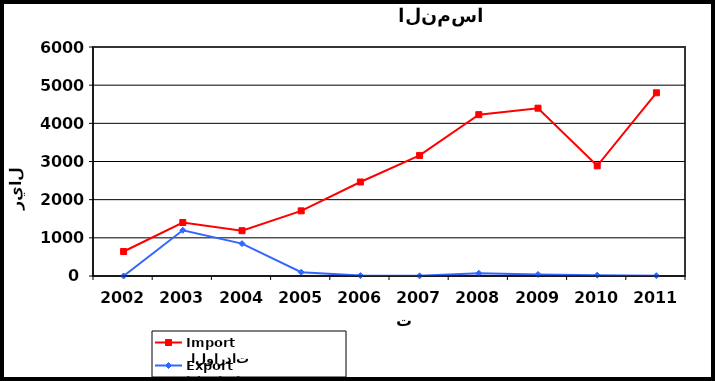
| Category |  الواردات           Import | الصادرات          Export |
|---|---|---|
| 2002.0 | 642 | 1 |
| 2003.0 | 1402 | 1199 |
| 2004.0 | 1187 | 849 |
| 2005.0 | 1707 | 98 |
| 2006.0 | 2463 | 11 |
| 2007.0 | 3159 | 4 |
| 2008.0 | 4227 | 73 |
| 2009.0 | 4397 | 40 |
| 2010.0 | 2887 | 22 |
| 2011.0 | 4800 | 8 |